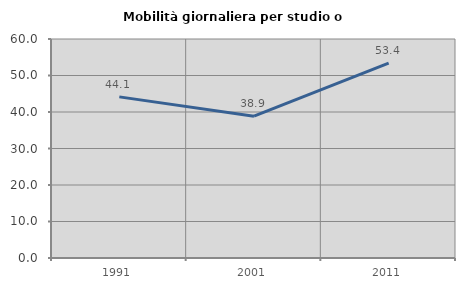
| Category | Mobilità giornaliera per studio o lavoro |
|---|---|
| 1991.0 | 44.141 |
| 2001.0 | 38.863 |
| 2011.0 | 53.403 |